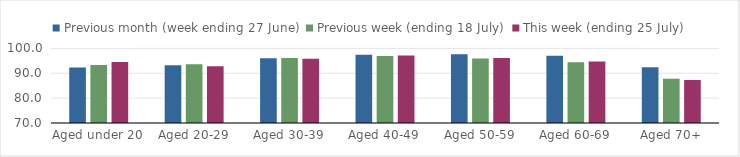
| Category | Previous month (week ending 27 June) | Previous week (ending 18 July) | This week (ending 25 July) |
|---|---|---|---|
| Aged under 20 | 92.368 | 93.329 | 94.565 |
| Aged 20-29 | 93.198 | 93.653 | 92.834 |
| Aged 30-39 | 96.055 | 96.191 | 95.867 |
| Aged 40-49 | 97.473 | 96.919 | 97.185 |
| Aged 50-59 | 97.635 | 95.953 | 96.187 |
| Aged 60-69 | 97.093 | 94.401 | 94.694 |
| Aged 70+ | 92.426 | 87.816 | 87.295 |